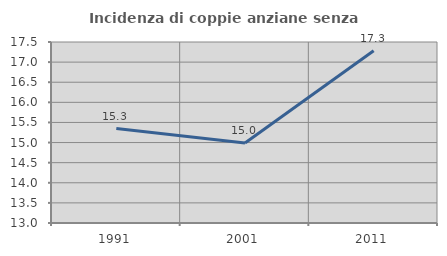
| Category | Incidenza di coppie anziane senza figli  |
|---|---|
| 1991.0 | 15.348 |
| 2001.0 | 14.988 |
| 2011.0 | 17.284 |